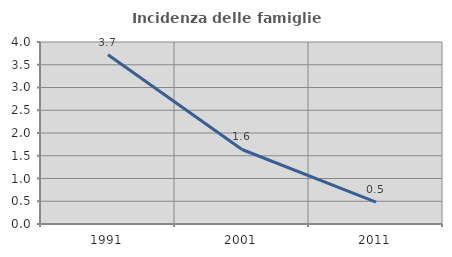
| Category | Incidenza delle famiglie numerose |
|---|---|
| 1991.0 | 3.721 |
| 2001.0 | 1.637 |
| 2011.0 | 0.481 |